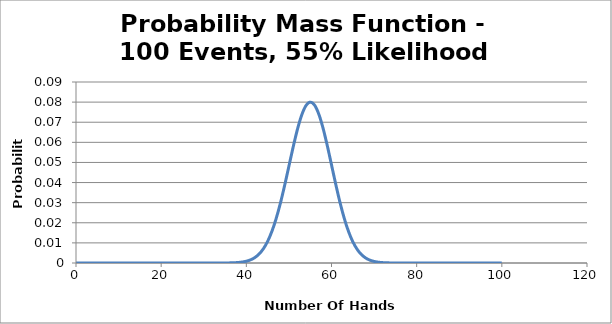
| Category | Series 0 |
|---|---|
| 0.0 | 0 |
| 1.0 | 0 |
| 2.0 | 0 |
| 3.0 | 0 |
| 4.0 | 0 |
| 5.0 | 0 |
| 6.0 | 0 |
| 7.0 | 0 |
| 8.0 | 0 |
| 9.0 | 0 |
| 10.0 | 0 |
| 11.0 | 0 |
| 12.0 | 0 |
| 13.0 | 0 |
| 14.0 | 0 |
| 15.0 | 0 |
| 16.0 | 0 |
| 17.0 | 0 |
| 18.0 | 0 |
| 19.0 | 0 |
| 20.0 | 0 |
| 21.0 | 0 |
| 22.0 | 0 |
| 23.0 | 0 |
| 24.0 | 0 |
| 25.0 | 0 |
| 26.0 | 0 |
| 27.0 | 0 |
| 28.0 | 0 |
| 29.0 | 0 |
| 30.0 | 0 |
| 31.0 | 0 |
| 32.0 | 0 |
| 33.0 | 0 |
| 34.0 | 0 |
| 35.0 | 0 |
| 36.0 | 0 |
| 37.0 | 0 |
| 38.0 | 0 |
| 39.0 | 0 |
| 40.0 | 0.001 |
| 41.0 | 0.002 |
| 42.0 | 0.003 |
| 43.0 | 0.004 |
| 44.0 | 0.007 |
| 45.0 | 0.011 |
| 46.0 | 0.016 |
| 47.0 | 0.022 |
| 48.0 | 0.03 |
| 49.0 | 0.039 |
| 50.0 | 0.048 |
| 51.0 | 0.058 |
| 52.0 | 0.066 |
| 53.0 | 0.074 |
| 54.0 | 0.078 |
| 55.0 | 0.08 |
| 56.0 | 0.079 |
| 57.0 | 0.074 |
| 58.0 | 0.067 |
| 59.0 | 0.058 |
| 60.0 | 0.049 |
| 61.0 | 0.039 |
| 62.0 | 0.03 |
| 63.0 | 0.022 |
| 64.0 | 0.016 |
| 65.0 | 0.011 |
| 66.0 | 0.007 |
| 67.0 | 0.004 |
| 68.0 | 0.003 |
| 69.0 | 0.001 |
| 70.0 | 0.001 |
| 71.0 | 0 |
| 72.0 | 0 |
| 73.0 | 0 |
| 74.0 | 0 |
| 75.0 | 0 |
| 76.0 | 0 |
| 77.0 | 0 |
| 78.0 | 0 |
| 79.0 | 0 |
| 80.0 | 0 |
| 81.0 | 0 |
| 82.0 | 0 |
| 83.0 | 0 |
| 84.0 | 0 |
| 85.0 | 0 |
| 86.0 | 0 |
| 87.0 | 0 |
| 88.0 | 0 |
| 89.0 | 0 |
| 90.0 | 0 |
| 91.0 | 0 |
| 92.0 | 0 |
| 93.0 | 0 |
| 94.0 | 0 |
| 95.0 | 0 |
| 96.0 | 0 |
| 97.0 | 0 |
| 98.0 | 0 |
| 99.0 | 0 |
| 100.0 | 0 |